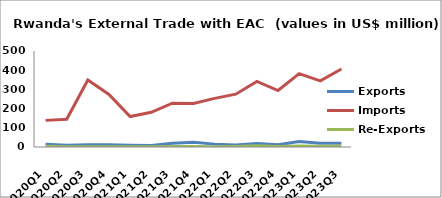
| Category | Exports | Imports | Re-Exports |
|---|---|---|---|
| 2020Q1 | 14.209 | 138.663 | 3.748 |
| 2020Q2 | 8.786 | 144.885 | 1.712 |
| 2020Q3 | 11.767 | 348.723 | 1.141 |
| 2020Q4 | 12.136 | 273.335 | 0.92 |
| 2021Q1 | 9.302 | 158.626 | 0.693 |
| 2021Q2 | 7.396 | 180.858 | 1.076 |
| 2021Q3 | 19.208 | 228.408 | 2.214 |
| 2021Q4 | 24.275 | 227.083 | 3.044 |
| 2022Q1 | 14.976 | 253.288 | 1.717 |
| 2022Q2 | 10.835 | 275.058 | 3.227 |
| 2022Q3 | 18.34 | 341.329 | 6.748 |
| 2022Q4 | 11.691 | 294.155 | 2.456 |
| 2023Q1 | 28.708 | 382.295 | 4.582 |
| 2023Q2 | 19.479 | 344.376 | 3.772 |
| 2023Q3 | 19.264 | 406.611 | 4.929 |